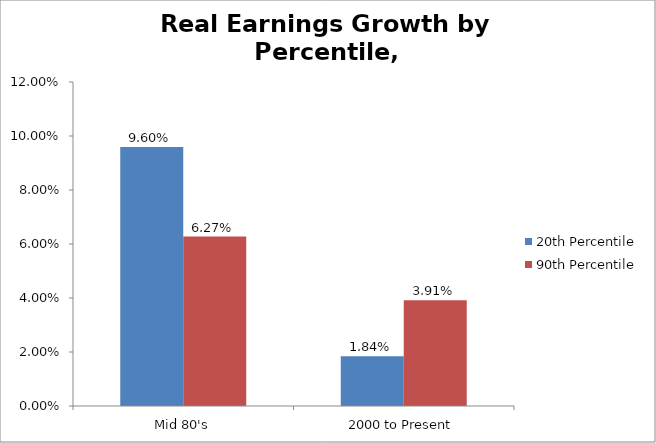
| Category | 20th Percentile | 90th Percentile |
|---|---|---|
| Mid 80's | 0.096 | 0.063 |
| 2000 to Present | 0.018 | 0.039 |